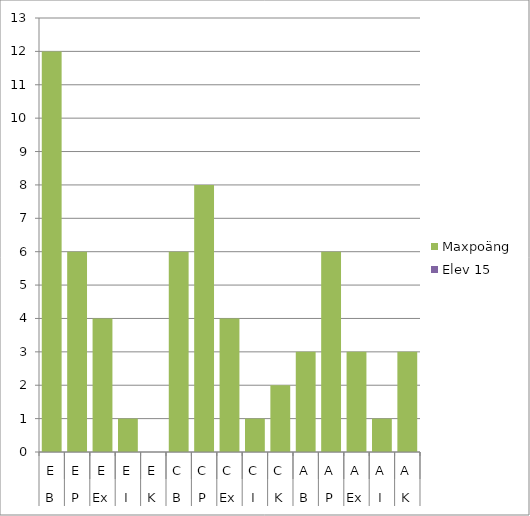
| Category | Maxpoäng | Elev 15 |
|---|---|---|
| 0 | 12 | 0 |
| 1 | 6 | 0 |
| 2 | 4 | 0 |
| 3 | 1 | 0 |
| 4 | 0 | 0 |
| 5 | 6 | 0 |
| 6 | 8 | 0 |
| 7 | 4 | 0 |
| 8 | 1 | 0 |
| 9 | 2 | 0 |
| 10 | 3 | 0 |
| 11 | 6 | 0 |
| 12 | 3 | 0 |
| 13 | 1 | 0 |
| 14 | 3 | 0 |